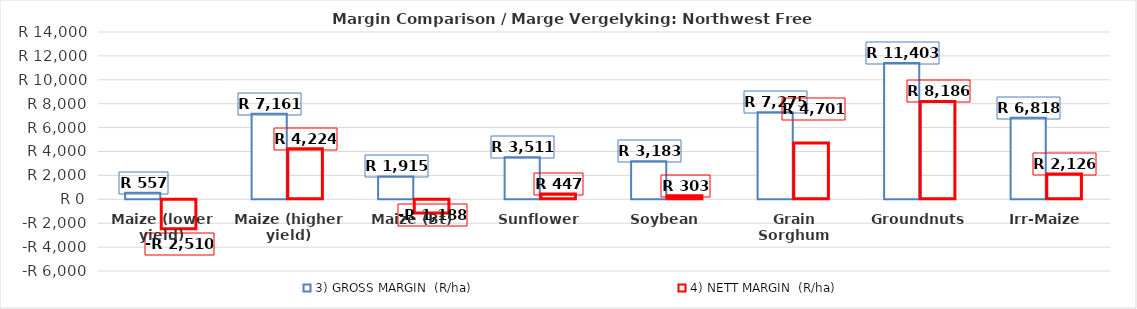
| Category | 3) GROSS MARGIN  (R/ha) | 4) NETT MARGIN  (R/ha) |
|---|---|---|
| Maize (lower yield) | 557.446 | -2510.424 |
| Maize (higher yield) | 7160.63 | 4224.1 |
| Maize (Bt) | 1915.274 | -1187.546 |
| Sunflower | 3510.624 | 447.114 |
| Soybean | 3182.985 | 303.485 |
| Grain Sorghum | 7275.093 | 4700.893 |
| Groundnuts | 11402.75 | 8186.3 |
| Irr-Maize | 6818.309 | 2126.029 |